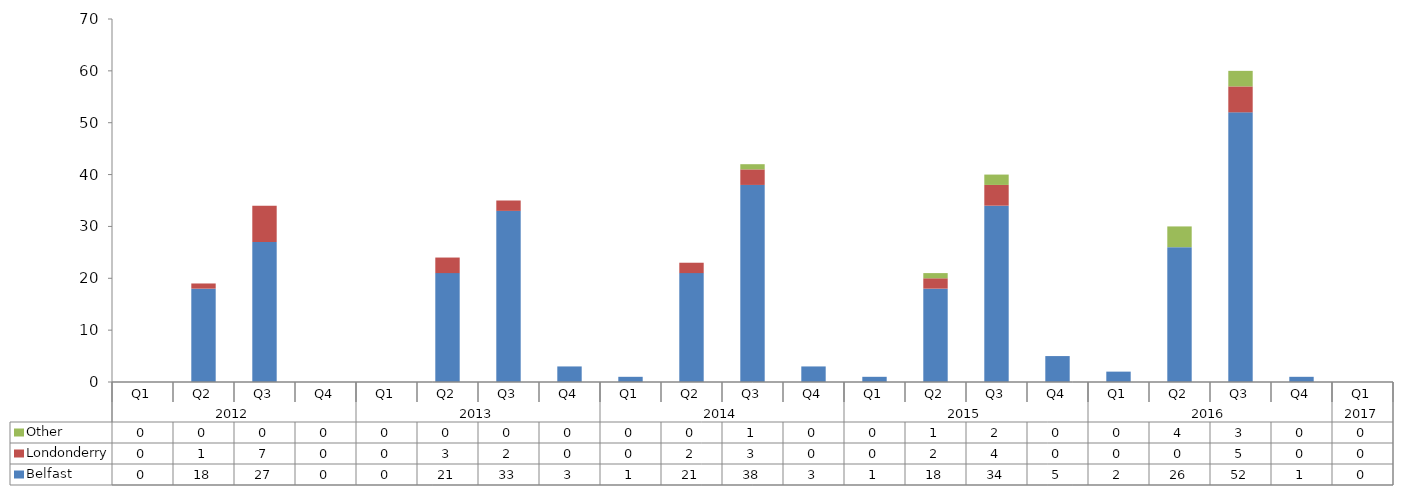
| Category | Belfast | Londonderry | Other |
|---|---|---|---|
| 0 | 0 | 0 | 0 |
| 1 | 18 | 1 | 0 |
| 2 | 27 | 7 | 0 |
| 3 | 0 | 0 | 0 |
| 4 | 0 | 0 | 0 |
| 5 | 21 | 3 | 0 |
| 6 | 33 | 2 | 0 |
| 7 | 3 | 0 | 0 |
| 8 | 1 | 0 | 0 |
| 9 | 21 | 2 | 0 |
| 10 | 38 | 3 | 1 |
| 11 | 3 | 0 | 0 |
| 12 | 1 | 0 | 0 |
| 13 | 18 | 2 | 1 |
| 14 | 34 | 4 | 2 |
| 15 | 5 | 0 | 0 |
| 16 | 2 | 0 | 0 |
| 17 | 26 | 0 | 4 |
| 18 | 52 | 5 | 3 |
| 19 | 1 | 0 | 0 |
| 20 | 0 | 0 | 0 |